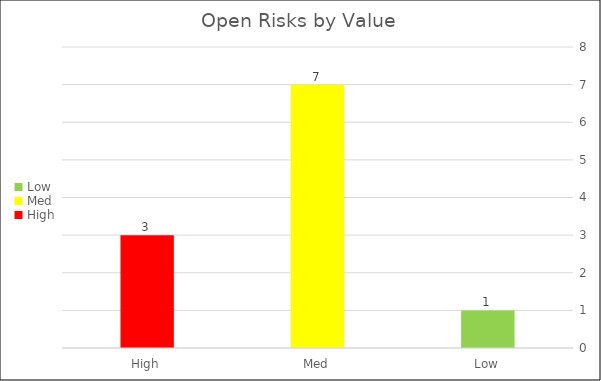
| Category | Count by Value |
|---|---|
| Low | 1 |
| Med | 7 |
| High | 3 |